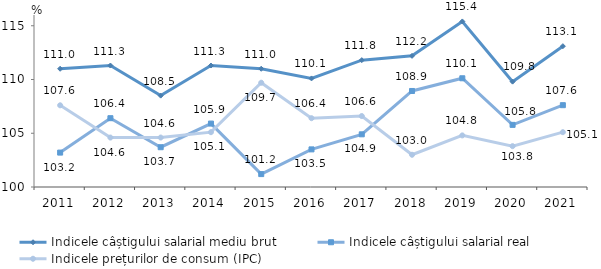
| Category | Indicele câștigului salarial mediu brut | Indicele câștigului salarial real | Indicele prețurilor de consum (IPC) |
|---|---|---|---|
| 2011.0 | 111 | 103.2 | 107.6 |
| 2012.0 | 111.3 | 106.4 | 104.6 |
| 2013.0 | 108.5 | 103.7 | 104.6 |
| 2014.0 | 111.3 | 105.9 | 105.1 |
| 2015.0 | 111 | 101.2 | 109.7 |
| 2016.0 | 110.1 | 103.5 | 106.4 |
| 2017.0 | 111.8 | 104.9 | 106.6 |
| 2018.0 | 112.2 | 108.932 | 103 |
| 2019.0 | 115.4 | 110.115 | 104.8 |
| 2020.0 | 109.8 | 105.78 | 103.8 |
| 2021.0 | 113.1 | 107.612 | 105.1 |